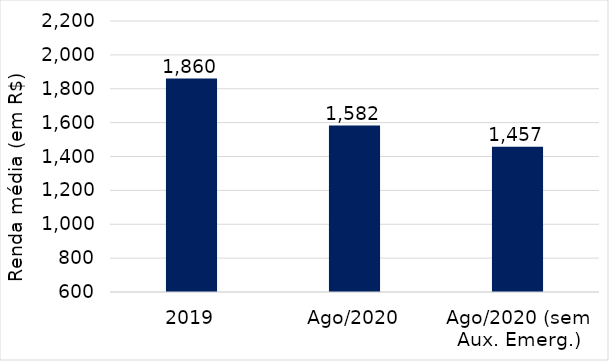
| Category | Series 0 |
|---|---|
| 2019 | 1859.906 |
| Ago/2020 | 1582.382 |
| Ago/2020 (sem Aux. Emerg.) | 1457.418 |